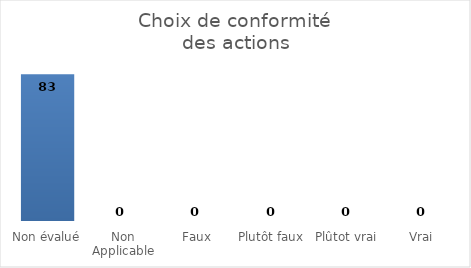
| Category | Choix de conformité 
des actions |
|---|---|
| Non évalué | 83 |
| Non Applicable | 0 |
| Faux | 0 |
| Plutôt faux | 0 |
| Plûtot vrai | 0 |
| Vrai | 0 |